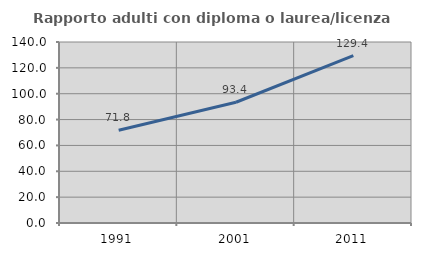
| Category | Rapporto adulti con diploma o laurea/licenza media  |
|---|---|
| 1991.0 | 71.795 |
| 2001.0 | 93.407 |
| 2011.0 | 129.412 |